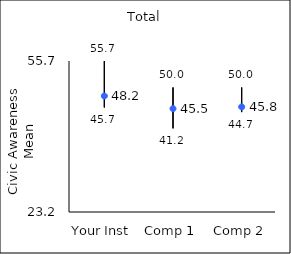
| Category | 25th percentile | 75th percentile | Mean |
|---|---|---|---|
| Your Inst | 45.7 | 55.7 | 48.16 |
| Comp 1 | 41.2 | 50 | 45.45 |
| Comp 2 | 44.7 | 50 | 45.82 |